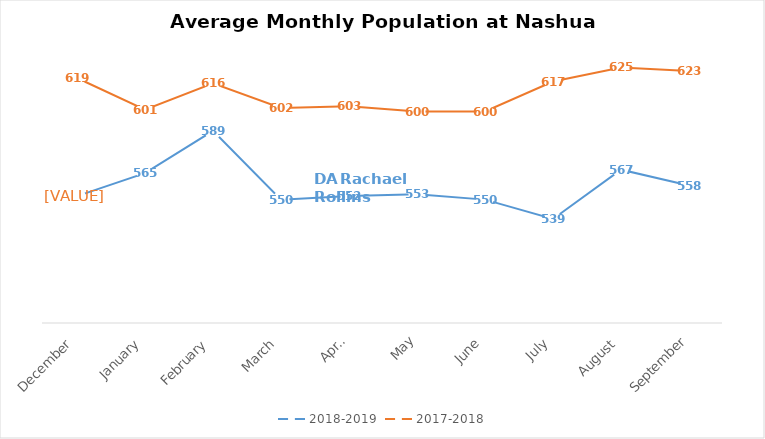
| Category | 2018-2019 | 2017-2018 |
|---|---|---|
| December | 552 | 619 |
| January | 565 | 601 |
| February | 589 | 616 |
| March | 550 | 602 |
| April | 552 | 603 |
| May | 553 | 600 |
| June | 550 | 600 |
| July | 539 | 617 |
| August | 567 | 625 |
| September | 558 | 623 |